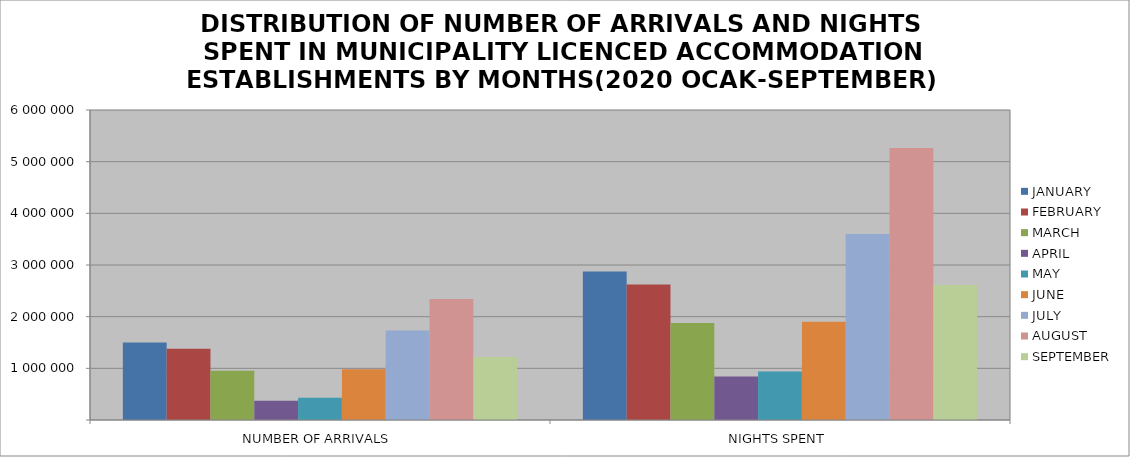
| Category | JANUARY | FEBRUARY | MARCH | APRIL | MAY | JUNE | JULY | AUGUST | SEPTEMBER |
|---|---|---|---|---|---|---|---|---|---|
| NUMBER OF ARRIVALS | 1497815 | 1380765 | 955554 | 372466 | 430328 | 981538 | 1730606 | 2342031 | 1217037 |
| NIGHTS SPENT | 2872303 | 2621819 | 1878971 | 839735 | 939652 | 1902057 | 3601580 | 5263679 | 2612279 |